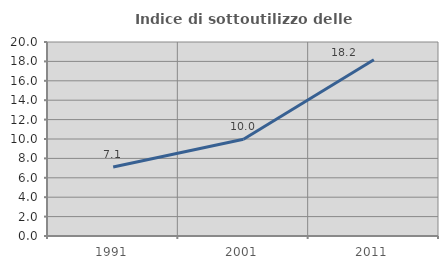
| Category | Indice di sottoutilizzo delle abitazioni  |
|---|---|
| 1991.0 | 7.117 |
| 2001.0 | 9.981 |
| 2011.0 | 18.164 |